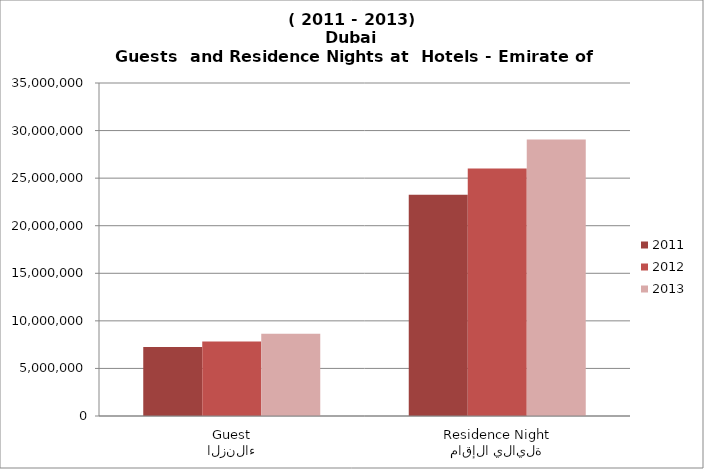
| Category | 2011 | 2012 | 2013 |
|---|---|---|---|
| النزلاء
Guests | 7262730 | 7823117 | 8641355 |
| ليالي الإقامة
Residence Nights | 23266874 | 26003103 | 29049743 |